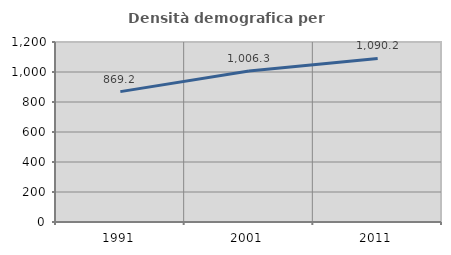
| Category | Densità demografica |
|---|---|
| 1991.0 | 869.221 |
| 2001.0 | 1006.333 |
| 2011.0 | 1090.247 |